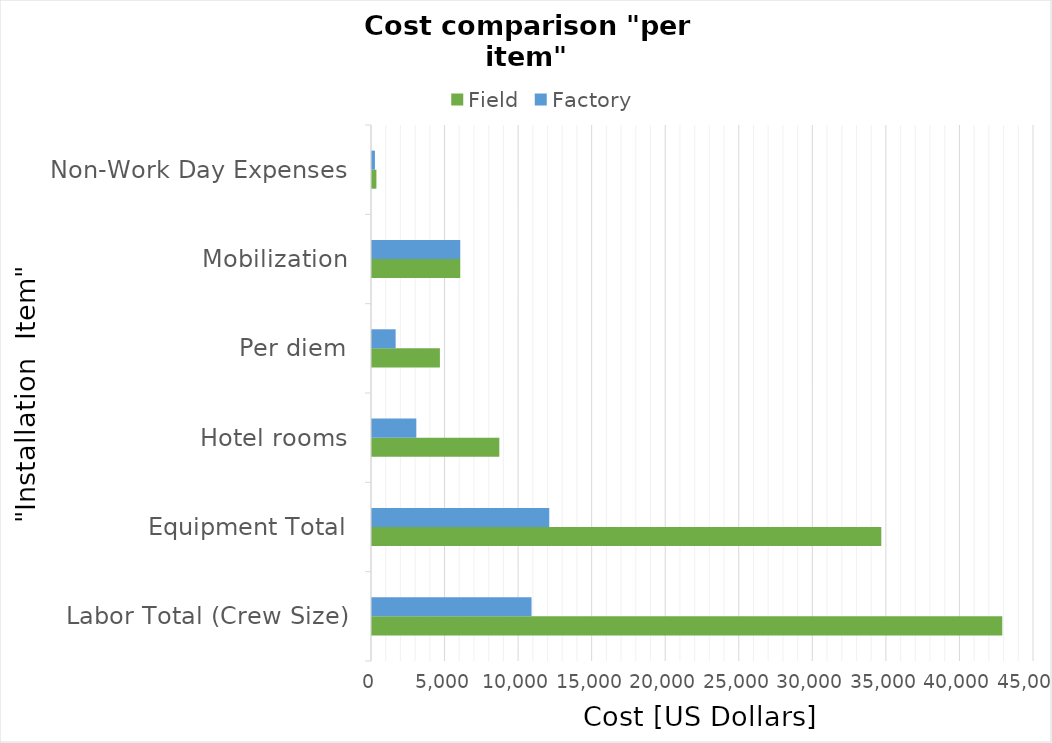
| Category | Field | Factory |
|---|---|---|
| Labor Total (Crew Size) | 42843.036 | 10845 |
| Equipment Total | 34620.635 | 12050 |
| Hotel rooms | 8655.159 | 3012.5 |
| Per diem | 4616.085 | 1606.667 |
| Mobilization | 6000 | 6000 |
| Non-Work Day Expenses | 300 | 200 |